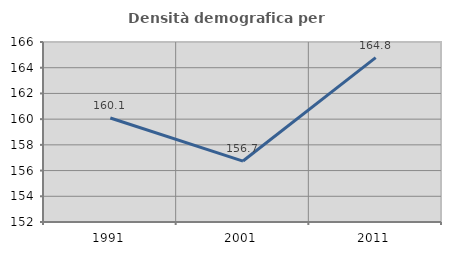
| Category | Densità demografica |
|---|---|
| 1991.0 | 160.092 |
| 2001.0 | 156.74 |
| 2011.0 | 164.784 |